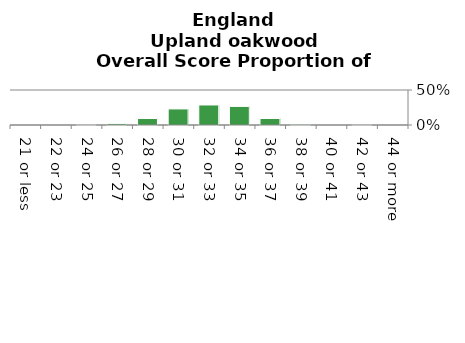
| Category | 0% |
|---|---|
| 21 or less | 0 |
| 22 or 23 | 0 |
| 24 or 25 | 0.002 |
| 26 or 27 | 0.019 |
| 28 or 29 | 0.093 |
| 30 or 31 | 0.229 |
| 32 or 33 | 0.286 |
| 34 or 35 | 0.265 |
| 36 or 37 | 0.093 |
| 38 or 39 | 0.012 |
| 40 or 41 | 0 |
| 42 or 43 | 0.001 |
| 44 or more | 0 |